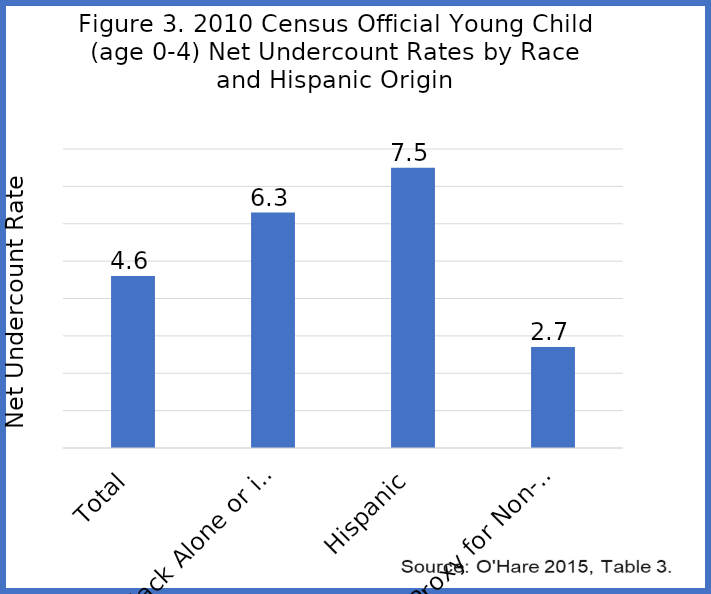
| Category | Net Undercount Rate |
|---|---|
| Total | 4.6 |
| Black Alone or in Combination  | 6.3 |
| Hispanic | 7.5 |
| Proxy for Non-Hispanc White  | 2.7 |